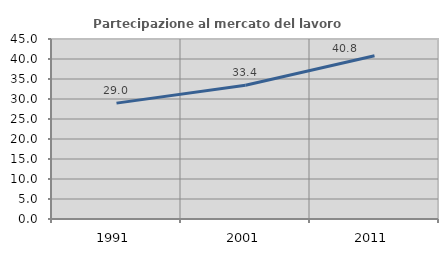
| Category | Partecipazione al mercato del lavoro  femminile |
|---|---|
| 1991.0 | 28.972 |
| 2001.0 | 33.446 |
| 2011.0 | 40.794 |